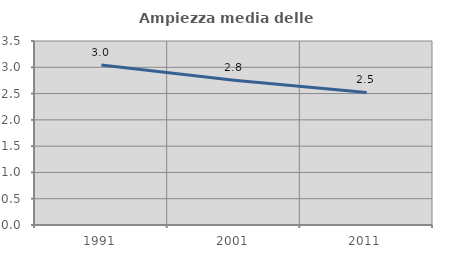
| Category | Ampiezza media delle famiglie |
|---|---|
| 1991.0 | 3.044 |
| 2001.0 | 2.754 |
| 2011.0 | 2.52 |